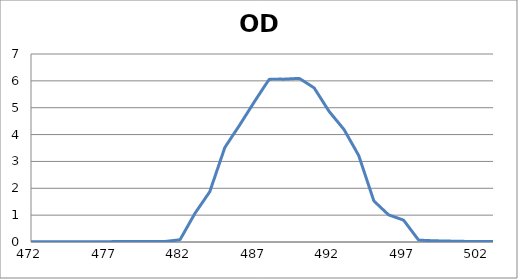
| Category | Series 0 |
|---|---|
| 2600.0 | 0.183 |
| 2599.0 | 0.183 |
| 2598.0 | 0.182 |
| 2597.0 | 0.182 |
| 2596.0 | 0.181 |
| 2595.0 | 0.18 |
| 2594.0 | 0.179 |
| 2593.0 | 0.178 |
| 2592.0 | 0.177 |
| 2591.0 | 0.175 |
| 2590.0 | 0.174 |
| 2589.0 | 0.173 |
| 2588.0 | 0.171 |
| 2587.0 | 0.169 |
| 2586.0 | 0.167 |
| 2585.0 | 0.166 |
| 2584.0 | 0.164 |
| 2583.0 | 0.163 |
| 2582.0 | 0.161 |
| 2581.0 | 0.159 |
| 2580.0 | 0.157 |
| 2579.0 | 0.155 |
| 2578.0 | 0.153 |
| 2577.0 | 0.151 |
| 2576.0 | 0.15 |
| 2575.0 | 0.148 |
| 2574.0 | 0.146 |
| 2573.0 | 0.145 |
| 2572.0 | 0.143 |
| 2571.0 | 0.141 |
| 2570.0 | 0.139 |
| 2569.0 | 0.138 |
| 2568.0 | 0.136 |
| 2567.0 | 0.135 |
| 2566.0 | 0.133 |
| 2565.0 | 0.132 |
| 2564.0 | 0.131 |
| 2563.0 | 0.13 |
| 2562.0 | 0.129 |
| 2561.0 | 0.129 |
| 2560.0 | 0.128 |
| 2559.0 | 0.128 |
| 2558.0 | 0.127 |
| 2557.0 | 0.127 |
| 2556.0 | 0.127 |
| 2555.0 | 0.127 |
| 2554.0 | 0.128 |
| 2553.0 | 0.128 |
| 2552.0 | 0.128 |
| 2551.0 | 0.129 |
| 2550.0 | 0.129 |
| 2549.0 | 0.13 |
| 2548.0 | 0.131 |
| 2547.0 | 0.132 |
| 2546.0 | 0.133 |
| 2545.0 | 0.133 |
| 2544.0 | 0.134 |
| 2543.0 | 0.135 |
| 2542.0 | 0.136 |
| 2541.0 | 0.137 |
| 2540.0 | 0.138 |
| 2539.0 | 0.138 |
| 2538.0 | 0.139 |
| 2537.0 | 0.139 |
| 2536.0 | 0.14 |
| 2535.0 | 0.14 |
| 2534.0 | 0.14 |
| 2533.0 | 0.14 |
| 2532.0 | 0.141 |
| 2531.0 | 0.141 |
| 2530.0 | 0.14 |
| 2529.0 | 0.14 |
| 2528.0 | 0.14 |
| 2527.0 | 0.139 |
| 2526.0 | 0.138 |
| 2525.0 | 0.137 |
| 2524.0 | 0.137 |
| 2523.0 | 0.136 |
| 2522.0 | 0.135 |
| 2521.0 | 0.133 |
| 2520.0 | 0.132 |
| 2519.0 | 0.13 |
| 2518.0 | 0.129 |
| 2517.0 | 0.127 |
| 2516.0 | 0.125 |
| 2515.0 | 0.123 |
| 2514.0 | 0.122 |
| 2513.0 | 0.12 |
| 2512.0 | 0.118 |
| 2511.0 | 0.116 |
| 2510.0 | 0.115 |
| 2509.0 | 0.113 |
| 2508.0 | 0.111 |
| 2507.0 | 0.109 |
| 2506.0 | 0.108 |
| 2505.0 | 0.106 |
| 2504.0 | 0.105 |
| 2503.0 | 0.104 |
| 2502.0 | 0.102 |
| 2501.0 | 0.101 |
| 2500.0 | 0.1 |
| 2499.0 | 0.1 |
| 2498.0 | 0.1 |
| 2497.0 | 0.099 |
| 2496.0 | 0.099 |
| 2495.0 | 0.099 |
| 2494.0 | 0.099 |
| 2493.0 | 0.1 |
| 2492.0 | 0.1 |
| 2491.0 | 0.101 |
| 2490.0 | 0.102 |
| 2489.0 | 0.103 |
| 2488.0 | 0.104 |
| 2487.0 | 0.105 |
| 2486.0 | 0.107 |
| 2485.0 | 0.108 |
| 2484.0 | 0.11 |
| 2483.0 | 0.112 |
| 2482.0 | 0.113 |
| 2481.0 | 0.115 |
| 2480.0 | 0.117 |
| 2479.0 | 0.119 |
| 2478.0 | 0.121 |
| 2477.0 | 0.123 |
| 2476.0 | 0.125 |
| 2475.0 | 0.126 |
| 2474.0 | 0.128 |
| 2473.0 | 0.13 |
| 2472.0 | 0.132 |
| 2471.0 | 0.133 |
| 2470.0 | 0.135 |
| 2469.0 | 0.136 |
| 2468.0 | 0.137 |
| 2467.0 | 0.137 |
| 2466.0 | 0.138 |
| 2465.0 | 0.139 |
| 2464.0 | 0.139 |
| 2463.0 | 0.139 |
| 2462.0 | 0.139 |
| 2461.0 | 0.139 |
| 2460.0 | 0.138 |
| 2459.0 | 0.138 |
| 2458.0 | 0.137 |
| 2457.0 | 0.136 |
| 2456.0 | 0.135 |
| 2455.0 | 0.134 |
| 2454.0 | 0.132 |
| 2453.0 | 0.131 |
| 2452.0 | 0.129 |
| 2451.0 | 0.127 |
| 2450.0 | 0.125 |
| 2449.0 | 0.123 |
| 2448.0 | 0.121 |
| 2447.0 | 0.119 |
| 2446.0 | 0.117 |
| 2445.0 | 0.115 |
| 2444.0 | 0.113 |
| 2443.0 | 0.111 |
| 2442.0 | 0.109 |
| 2441.0 | 0.107 |
| 2440.0 | 0.105 |
| 2439.0 | 0.103 |
| 2438.0 | 0.101 |
| 2437.0 | 0.1 |
| 2436.0 | 0.098 |
| 2435.0 | 0.097 |
| 2434.0 | 0.096 |
| 2433.0 | 0.095 |
| 2432.0 | 0.095 |
| 2431.0 | 0.094 |
| 2430.0 | 0.094 |
| 2429.0 | 0.094 |
| 2428.0 | 0.094 |
| 2427.0 | 0.095 |
| 2426.0 | 0.096 |
| 2425.0 | 0.097 |
| 2424.0 | 0.098 |
| 2423.0 | 0.099 |
| 2422.0 | 0.101 |
| 2421.0 | 0.103 |
| 2420.0 | 0.105 |
| 2419.0 | 0.107 |
| 2418.0 | 0.109 |
| 2417.0 | 0.111 |
| 2416.0 | 0.113 |
| 2415.0 | 0.115 |
| 2414.0 | 0.118 |
| 2413.0 | 0.12 |
| 2412.0 | 0.123 |
| 2411.0 | 0.125 |
| 2410.0 | 0.127 |
| 2409.0 | 0.129 |
| 2408.0 | 0.131 |
| 2407.0 | 0.133 |
| 2406.0 | 0.135 |
| 2405.0 | 0.137 |
| 2404.0 | 0.138 |
| 2403.0 | 0.14 |
| 2402.0 | 0.141 |
| 2401.0 | 0.142 |
| 2400.0 | 0.143 |
| 2399.0 | 0.143 |
| 2398.0 | 0.144 |
| 2397.0 | 0.144 |
| 2396.0 | 0.144 |
| 2395.0 | 0.144 |
| 2394.0 | 0.143 |
| 2393.0 | 0.143 |
| 2392.0 | 0.142 |
| 2391.0 | 0.141 |
| 2390.0 | 0.139 |
| 2389.0 | 0.138 |
| 2388.0 | 0.136 |
| 2387.0 | 0.134 |
| 2386.0 | 0.132 |
| 2385.0 | 0.131 |
| 2384.0 | 0.128 |
| 2383.0 | 0.126 |
| 2382.0 | 0.124 |
| 2381.0 | 0.122 |
| 2380.0 | 0.119 |
| 2379.0 | 0.117 |
| 2378.0 | 0.115 |
| 2377.0 | 0.112 |
| 2376.0 | 0.11 |
| 2375.0 | 0.108 |
| 2374.0 | 0.106 |
| 2373.0 | 0.104 |
| 2372.0 | 0.103 |
| 2371.0 | 0.101 |
| 2370.0 | 0.1 |
| 2369.0 | 0.098 |
| 2368.0 | 0.097 |
| 2367.0 | 0.096 |
| 2366.0 | 0.096 |
| 2365.0 | 0.095 |
| 2364.0 | 0.095 |
| 2363.0 | 0.095 |
| 2362.0 | 0.095 |
| 2361.0 | 0.095 |
| 2360.0 | 0.095 |
| 2359.0 | 0.096 |
| 2358.0 | 0.097 |
| 2357.0 | 0.098 |
| 2356.0 | 0.099 |
| 2355.0 | 0.1 |
| 2354.0 | 0.101 |
| 2353.0 | 0.103 |
| 2352.0 | 0.104 |
| 2351.0 | 0.105 |
| 2350.0 | 0.107 |
| 2349.0 | 0.108 |
| 2348.0 | 0.11 |
| 2347.0 | 0.111 |
| 2346.0 | 0.113 |
| 2345.0 | 0.114 |
| 2344.0 | 0.115 |
| 2343.0 | 0.117 |
| 2342.0 | 0.118 |
| 2341.0 | 0.118 |
| 2340.0 | 0.119 |
| 2339.0 | 0.12 |
| 2338.0 | 0.12 |
| 2337.0 | 0.121 |
| 2336.0 | 0.121 |
| 2335.0 | 0.121 |
| 2334.0 | 0.121 |
| 2333.0 | 0.121 |
| 2332.0 | 0.12 |
| 2331.0 | 0.12 |
| 2330.0 | 0.119 |
| 2329.0 | 0.119 |
| 2328.0 | 0.118 |
| 2327.0 | 0.117 |
| 2326.0 | 0.116 |
| 2325.0 | 0.115 |
| 2324.0 | 0.113 |
| 2323.0 | 0.112 |
| 2322.0 | 0.111 |
| 2321.0 | 0.11 |
| 2320.0 | 0.108 |
| 2319.0 | 0.107 |
| 2318.0 | 0.106 |
| 2317.0 | 0.104 |
| 2316.0 | 0.103 |
| 2315.0 | 0.102 |
| 2314.0 | 0.101 |
| 2313.0 | 0.1 |
| 2312.0 | 0.1 |
| 2311.0 | 0.099 |
| 2310.0 | 0.099 |
| 2309.0 | 0.098 |
| 2308.0 | 0.098 |
| 2307.0 | 0.098 |
| 2306.0 | 0.098 |
| 2305.0 | 0.099 |
| 2304.0 | 0.099 |
| 2303.0 | 0.099 |
| 2302.0 | 0.1 |
| 2301.0 | 0.101 |
| 2300.0 | 0.102 |
| 2299.0 | 0.103 |
| 2298.0 | 0.104 |
| 2297.0 | 0.105 |
| 2296.0 | 0.107 |
| 2295.0 | 0.108 |
| 2294.0 | 0.109 |
| 2293.0 | 0.11 |
| 2292.0 | 0.112 |
| 2291.0 | 0.113 |
| 2290.0 | 0.114 |
| 2289.0 | 0.116 |
| 2288.0 | 0.117 |
| 2287.0 | 0.119 |
| 2286.0 | 0.12 |
| 2285.0 | 0.121 |
| 2284.0 | 0.122 |
| 2283.0 | 0.123 |
| 2282.0 | 0.124 |
| 2281.0 | 0.125 |
| 2280.0 | 0.125 |
| 2279.0 | 0.126 |
| 2278.0 | 0.127 |
| 2277.0 | 0.127 |
| 2276.0 | 0.127 |
| 2275.0 | 0.128 |
| 2274.0 | 0.128 |
| 2273.0 | 0.128 |
| 2272.0 | 0.128 |
| 2271.0 | 0.128 |
| 2270.0 | 0.128 |
| 2269.0 | 0.128 |
| 2268.0 | 0.128 |
| 2267.0 | 0.127 |
| 2266.0 | 0.127 |
| 2265.0 | 0.127 |
| 2264.0 | 0.126 |
| 2263.0 | 0.126 |
| 2262.0 | 0.126 |
| 2261.0 | 0.125 |
| 2260.0 | 0.125 |
| 2259.0 | 0.125 |
| 2258.0 | 0.125 |
| 2257.0 | 0.125 |
| 2256.0 | 0.125 |
| 2255.0 | 0.125 |
| 2254.0 | 0.125 |
| 2253.0 | 0.124 |
| 2252.0 | 0.124 |
| 2251.0 | 0.125 |
| 2250.0 | 0.125 |
| 2249.0 | 0.125 |
| 2248.0 | 0.125 |
| 2247.0 | 0.125 |
| 2246.0 | 0.125 |
| 2245.0 | 0.126 |
| 2244.0 | 0.126 |
| 2243.0 | 0.126 |
| 2242.0 | 0.127 |
| 2241.0 | 0.127 |
| 2240.0 | 0.127 |
| 2239.0 | 0.128 |
| 2238.0 | 0.128 |
| 2237.0 | 0.129 |
| 2236.0 | 0.129 |
| 2235.0 | 0.129 |
| 2234.0 | 0.13 |
| 2233.0 | 0.131 |
| 2232.0 | 0.131 |
| 2231.0 | 0.132 |
| 2230.0 | 0.133 |
| 2229.0 | 0.134 |
| 2228.0 | 0.135 |
| 2227.0 | 0.136 |
| 2226.0 | 0.137 |
| 2225.0 | 0.138 |
| 2224.0 | 0.14 |
| 2223.0 | 0.142 |
| 2222.0 | 0.143 |
| 2221.0 | 0.145 |
| 2220.0 | 0.146 |
| 2219.0 | 0.148 |
| 2218.0 | 0.15 |
| 2217.0 | 0.151 |
| 2216.0 | 0.152 |
| 2215.0 | 0.154 |
| 2214.0 | 0.155 |
| 2213.0 | 0.156 |
| 2212.0 | 0.157 |
| 2211.0 | 0.158 |
| 2210.0 | 0.158 |
| 2209.0 | 0.158 |
| 2208.0 | 0.158 |
| 2207.0 | 0.157 |
| 2206.0 | 0.156 |
| 2205.0 | 0.155 |
| 2204.0 | 0.153 |
| 2203.0 | 0.151 |
| 2202.0 | 0.149 |
| 2201.0 | 0.146 |
| 2200.0 | 0.143 |
| 2199.0 | 0.14 |
| 2198.0 | 0.137 |
| 2197.0 | 0.134 |
| 2196.0 | 0.131 |
| 2195.0 | 0.128 |
| 2194.0 | 0.125 |
| 2193.0 | 0.123 |
| 2192.0 | 0.12 |
| 2191.0 | 0.118 |
| 2190.0 | 0.116 |
| 2189.0 | 0.113 |
| 2188.0 | 0.111 |
| 2187.0 | 0.109 |
| 2186.0 | 0.107 |
| 2185.0 | 0.106 |
| 2184.0 | 0.104 |
| 2183.0 | 0.102 |
| 2182.0 | 0.101 |
| 2181.0 | 0.099 |
| 2180.0 | 0.098 |
| 2179.0 | 0.096 |
| 2178.0 | 0.095 |
| 2177.0 | 0.094 |
| 2176.0 | 0.093 |
| 2175.0 | 0.092 |
| 2174.0 | 0.091 |
| 2173.0 | 0.09 |
| 2172.0 | 0.09 |
| 2171.0 | 0.09 |
| 2170.0 | 0.09 |
| 2169.0 | 0.09 |
| 2168.0 | 0.09 |
| 2167.0 | 0.09 |
| 2166.0 | 0.091 |
| 2165.0 | 0.092 |
| 2164.0 | 0.093 |
| 2163.0 | 0.094 |
| 2162.0 | 0.095 |
| 2161.0 | 0.097 |
| 2160.0 | 0.099 |
| 2159.0 | 0.101 |
| 2158.0 | 0.103 |
| 2157.0 | 0.105 |
| 2156.0 | 0.107 |
| 2155.0 | 0.11 |
| 2154.0 | 0.112 |
| 2153.0 | 0.114 |
| 2152.0 | 0.117 |
| 2151.0 | 0.119 |
| 2150.0 | 0.121 |
| 2149.0 | 0.123 |
| 2148.0 | 0.125 |
| 2147.0 | 0.126 |
| 2146.0 | 0.128 |
| 2145.0 | 0.129 |
| 2144.0 | 0.13 |
| 2143.0 | 0.131 |
| 2142.0 | 0.132 |
| 2141.0 | 0.132 |
| 2140.0 | 0.132 |
| 2139.0 | 0.132 |
| 2138.0 | 0.132 |
| 2137.0 | 0.131 |
| 2136.0 | 0.13 |
| 2135.0 | 0.129 |
| 2134.0 | 0.128 |
| 2133.0 | 0.127 |
| 2132.0 | 0.126 |
| 2131.0 | 0.124 |
| 2130.0 | 0.122 |
| 2129.0 | 0.121 |
| 2128.0 | 0.119 |
| 2127.0 | 0.117 |
| 2126.0 | 0.116 |
| 2125.0 | 0.114 |
| 2124.0 | 0.112 |
| 2123.0 | 0.111 |
| 2122.0 | 0.109 |
| 2121.0 | 0.108 |
| 2120.0 | 0.107 |
| 2119.0 | 0.107 |
| 2118.0 | 0.106 |
| 2117.0 | 0.106 |
| 2116.0 | 0.106 |
| 2115.0 | 0.106 |
| 2114.0 | 0.107 |
| 2113.0 | 0.108 |
| 2112.0 | 0.109 |
| 2111.0 | 0.111 |
| 2110.0 | 0.112 |
| 2109.0 | 0.114 |
| 2108.0 | 0.116 |
| 2107.0 | 0.118 |
| 2106.0 | 0.12 |
| 2105.0 | 0.123 |
| 2104.0 | 0.125 |
| 2103.0 | 0.127 |
| 2102.0 | 0.129 |
| 2101.0 | 0.131 |
| 2100.0 | 0.133 |
| 2099.0 | 0.134 |
| 2098.0 | 0.136 |
| 2097.0 | 0.137 |
| 2096.0 | 0.137 |
| 2095.0 | 0.138 |
| 2094.0 | 0.138 |
| 2093.0 | 0.138 |
| 2092.0 | 0.138 |
| 2091.0 | 0.137 |
| 2090.0 | 0.136 |
| 2089.0 | 0.135 |
| 2088.0 | 0.133 |
| 2087.0 | 0.131 |
| 2086.0 | 0.129 |
| 2085.0 | 0.127 |
| 2084.0 | 0.125 |
| 2083.0 | 0.122 |
| 2082.0 | 0.12 |
| 2081.0 | 0.117 |
| 2080.0 | 0.114 |
| 2079.0 | 0.112 |
| 2078.0 | 0.109 |
| 2077.0 | 0.107 |
| 2076.0 | 0.105 |
| 2075.0 | 0.103 |
| 2074.0 | 0.102 |
| 2073.0 | 0.1 |
| 2072.0 | 0.1 |
| 2071.0 | 0.099 |
| 2070.0 | 0.1 |
| 2069.0 | 0.1 |
| 2068.0 | 0.101 |
| 2067.0 | 0.103 |
| 2066.0 | 0.105 |
| 2065.0 | 0.107 |
| 2064.0 | 0.11 |
| 2063.0 | 0.112 |
| 2062.0 | 0.116 |
| 2061.0 | 0.119 |
| 2060.0 | 0.122 |
| 2059.0 | 0.125 |
| 2058.0 | 0.129 |
| 2057.0 | 0.132 |
| 2056.0 | 0.135 |
| 2055.0 | 0.138 |
| 2054.0 | 0.141 |
| 2053.0 | 0.143 |
| 2052.0 | 0.146 |
| 2051.0 | 0.147 |
| 2050.0 | 0.149 |
| 2049.0 | 0.15 |
| 2048.0 | 0.151 |
| 2047.0 | 0.151 |
| 2046.0 | 0.15 |
| 2045.0 | 0.15 |
| 2044.0 | 0.149 |
| 2043.0 | 0.147 |
| 2042.0 | 0.145 |
| 2041.0 | 0.143 |
| 2040.0 | 0.14 |
| 2039.0 | 0.138 |
| 2038.0 | 0.135 |
| 2037.0 | 0.132 |
| 2036.0 | 0.128 |
| 2035.0 | 0.125 |
| 2034.0 | 0.122 |
| 2033.0 | 0.119 |
| 2032.0 | 0.117 |
| 2031.0 | 0.114 |
| 2030.0 | 0.112 |
| 2029.0 | 0.111 |
| 2028.0 | 0.11 |
| 2027.0 | 0.109 |
| 2026.0 | 0.109 |
| 2025.0 | 0.11 |
| 2024.0 | 0.111 |
| 2023.0 | 0.113 |
| 2022.0 | 0.116 |
| 2021.0 | 0.119 |
| 2020.0 | 0.122 |
| 2019.0 | 0.126 |
| 2018.0 | 0.13 |
| 2017.0 | 0.135 |
| 2016.0 | 0.139 |
| 2015.0 | 0.143 |
| 2014.0 | 0.148 |
| 2013.0 | 0.152 |
| 2012.0 | 0.157 |
| 2011.0 | 0.161 |
| 2010.0 | 0.164 |
| 2009.0 | 0.168 |
| 2008.0 | 0.171 |
| 2007.0 | 0.173 |
| 2006.0 | 0.175 |
| 2005.0 | 0.177 |
| 2004.0 | 0.177 |
| 2003.0 | 0.178 |
| 2002.0 | 0.178 |
| 2001.0 | 0.177 |
| 2000.0 | 0.175 |
| 1999.0 | 0.173 |
| 1998.0 | 0.17 |
| 1997.0 | 0.167 |
| 1996.0 | 0.164 |
| 1995.0 | 0.16 |
| 1994.0 | 0.155 |
| 1993.0 | 0.151 |
| 1992.0 | 0.147 |
| 1991.0 | 0.143 |
| 1990.0 | 0.138 |
| 1989.0 | 0.135 |
| 1988.0 | 0.131 |
| 1987.0 | 0.128 |
| 1986.0 | 0.126 |
| 1985.0 | 0.125 |
| 1984.0 | 0.124 |
| 1983.0 | 0.124 |
| 1982.0 | 0.125 |
| 1981.0 | 0.127 |
| 1980.0 | 0.129 |
| 1979.0 | 0.133 |
| 1978.0 | 0.137 |
| 1977.0 | 0.142 |
| 1976.0 | 0.147 |
| 1975.0 | 0.152 |
| 1974.0 | 0.159 |
| 1973.0 | 0.165 |
| 1972.0 | 0.171 |
| 1971.0 | 0.178 |
| 1970.0 | 0.184 |
| 1969.0 | 0.191 |
| 1968.0 | 0.197 |
| 1967.0 | 0.202 |
| 1966.0 | 0.207 |
| 1965.0 | 0.211 |
| 1964.0 | 0.215 |
| 1963.0 | 0.217 |
| 1962.0 | 0.22 |
| 1961.0 | 0.221 |
| 1960.0 | 0.221 |
| 1959.0 | 0.221 |
| 1958.0 | 0.219 |
| 1957.0 | 0.217 |
| 1956.0 | 0.213 |
| 1955.0 | 0.209 |
| 1954.0 | 0.204 |
| 1953.0 | 0.198 |
| 1952.0 | 0.192 |
| 1951.0 | 0.186 |
| 1950.0 | 0.178 |
| 1949.0 | 0.17 |
| 1948.0 | 0.163 |
| 1947.0 | 0.155 |
| 1946.0 | 0.147 |
| 1945.0 | 0.14 |
| 1944.0 | 0.132 |
| 1943.0 | 0.126 |
| 1942.0 | 0.121 |
| 1941.0 | 0.116 |
| 1940.0 | 0.112 |
| 1939.0 | 0.109 |
| 1938.0 | 0.108 |
| 1937.0 | 0.107 |
| 1936.0 | 0.108 |
| 1935.0 | 0.109 |
| 1934.0 | 0.112 |
| 1933.0 | 0.115 |
| 1932.0 | 0.119 |
| 1931.0 | 0.123 |
| 1930.0 | 0.128 |
| 1929.0 | 0.133 |
| 1928.0 | 0.139 |
| 1927.0 | 0.145 |
| 1926.0 | 0.151 |
| 1925.0 | 0.156 |
| 1924.0 | 0.161 |
| 1923.0 | 0.165 |
| 1922.0 | 0.169 |
| 1921.0 | 0.173 |
| 1920.0 | 0.176 |
| 1919.0 | 0.178 |
| 1918.0 | 0.18 |
| 1917.0 | 0.18 |
| 1916.0 | 0.179 |
| 1915.0 | 0.178 |
| 1914.0 | 0.176 |
| 1913.0 | 0.173 |
| 1912.0 | 0.171 |
| 1911.0 | 0.168 |
| 1910.0 | 0.164 |
| 1909.0 | 0.16 |
| 1908.0 | 0.155 |
| 1907.0 | 0.151 |
| 1906.0 | 0.146 |
| 1905.0 | 0.142 |
| 1904.0 | 0.139 |
| 1903.0 | 0.136 |
| 1902.0 | 0.133 |
| 1901.0 | 0.131 |
| 1900.0 | 0.13 |
| 1899.0 | 0.129 |
| 1898.0 | 0.13 |
| 1897.0 | 0.13 |
| 1896.0 | 0.132 |
| 1895.0 | 0.133 |
| 1894.0 | 0.135 |
| 1893.0 | 0.138 |
| 1892.0 | 0.141 |
| 1891.0 | 0.146 |
| 1890.0 | 0.15 |
| 1889.0 | 0.154 |
| 1888.0 | 0.157 |
| 1887.0 | 0.16 |
| 1886.0 | 0.163 |
| 1885.0 | 0.165 |
| 1884.0 | 0.167 |
| 1883.0 | 0.169 |
| 1882.0 | 0.17 |
| 1881.0 | 0.171 |
| 1880.0 | 0.17 |
| 1879.0 | 0.169 |
| 1878.0 | 0.166 |
| 1877.0 | 0.163 |
| 1876.0 | 0.16 |
| 1875.0 | 0.156 |
| 1874.0 | 0.152 |
| 1873.0 | 0.147 |
| 1872.0 | 0.141 |
| 1871.0 | 0.136 |
| 1870.0 | 0.131 |
| 1869.0 | 0.126 |
| 1868.0 | 0.121 |
| 1867.0 | 0.117 |
| 1866.0 | 0.113 |
| 1865.0 | 0.11 |
| 1864.0 | 0.109 |
| 1863.0 | 0.107 |
| 1862.0 | 0.107 |
| 1861.0 | 0.108 |
| 1860.0 | 0.11 |
| 1859.0 | 0.113 |
| 1858.0 | 0.116 |
| 1857.0 | 0.12 |
| 1856.0 | 0.124 |
| 1855.0 | 0.129 |
| 1854.0 | 0.134 |
| 1853.0 | 0.139 |
| 1852.0 | 0.144 |
| 1851.0 | 0.149 |
| 1850.0 | 0.153 |
| 1849.0 | 0.156 |
| 1848.0 | 0.159 |
| 1847.0 | 0.163 |
| 1846.0 | 0.165 |
| 1845.0 | 0.166 |
| 1844.0 | 0.166 |
| 1843.0 | 0.164 |
| 1842.0 | 0.161 |
| 1841.0 | 0.158 |
| 1840.0 | 0.155 |
| 1839.0 | 0.151 |
| 1838.0 | 0.146 |
| 1837.0 | 0.14 |
| 1836.0 | 0.133 |
| 1835.0 | 0.126 |
| 1834.0 | 0.12 |
| 1833.0 | 0.114 |
| 1832.0 | 0.108 |
| 1831.0 | 0.103 |
| 1830.0 | 0.099 |
| 1829.0 | 0.096 |
| 1828.0 | 0.094 |
| 1827.0 | 0.094 |
| 1826.0 | 0.095 |
| 1825.0 | 0.098 |
| 1824.0 | 0.102 |
| 1823.0 | 0.106 |
| 1822.0 | 0.111 |
| 1821.0 | 0.119 |
| 1820.0 | 0.128 |
| 1819.0 | 0.138 |
| 1818.0 | 0.147 |
| 1817.0 | 0.155 |
| 1816.0 | 0.164 |
| 1815.0 | 0.173 |
| 1814.0 | 0.181 |
| 1813.0 | 0.189 |
| 1812.0 | 0.196 |
| 1811.0 | 0.203 |
| 1810.0 | 0.209 |
| 1809.0 | 0.213 |
| 1808.0 | 0.216 |
| 1807.0 | 0.219 |
| 1806.0 | 0.22 |
| 1805.0 | 0.221 |
| 1804.0 | 0.22 |
| 1803.0 | 0.219 |
| 1802.0 | 0.216 |
| 1801.0 | 0.213 |
| 1800.0 | 0.209 |
| 1799.0 | 0.205 |
| 1798.0 | 0.201 |
| 1797.0 | 0.196 |
| 1796.0 | 0.192 |
| 1795.0 | 0.188 |
| 1794.0 | 0.185 |
| 1793.0 | 0.182 |
| 1792.0 | 0.18 |
| 1791.0 | 0.179 |
| 1790.0 | 0.179 |
| 1789.0 | 0.18 |
| 1788.0 | 0.182 |
| 1787.0 | 0.185 |
| 1786.0 | 0.189 |
| 1785.0 | 0.193 |
| 1784.0 | 0.198 |
| 1783.0 | 0.204 |
| 1782.0 | 0.209 |
| 1781.0 | 0.214 |
| 1780.0 | 0.219 |
| 1779.0 | 0.223 |
| 1778.0 | 0.227 |
| 1777.0 | 0.23 |
| 1776.0 | 0.232 |
| 1775.0 | 0.233 |
| 1774.0 | 0.233 |
| 1773.0 | 0.232 |
| 1772.0 | 0.229 |
| 1771.0 | 0.226 |
| 1770.0 | 0.221 |
| 1769.0 | 0.215 |
| 1768.0 | 0.208 |
| 1767.0 | 0.2 |
| 1766.0 | 0.191 |
| 1765.0 | 0.182 |
| 1764.0 | 0.172 |
| 1763.0 | 0.162 |
| 1762.0 | 0.152 |
| 1761.0 | 0.142 |
| 1760.0 | 0.133 |
| 1759.0 | 0.125 |
| 1758.0 | 0.117 |
| 1757.0 | 0.112 |
| 1756.0 | 0.107 |
| 1755.0 | 0.105 |
| 1754.0 | 0.104 |
| 1753.0 | 0.105 |
| 1752.0 | 0.108 |
| 1751.0 | 0.112 |
| 1750.0 | 0.118 |
| 1749.0 | 0.124 |
| 1748.0 | 0.131 |
| 1747.0 | 0.139 |
| 1746.0 | 0.147 |
| 1745.0 | 0.155 |
| 1744.0 | 0.163 |
| 1743.0 | 0.169 |
| 1742.0 | 0.175 |
| 1741.0 | 0.18 |
| 1740.0 | 0.184 |
| 1739.0 | 0.187 |
| 1738.0 | 0.189 |
| 1737.0 | 0.189 |
| 1736.0 | 0.188 |
| 1735.0 | 0.185 |
| 1734.0 | 0.182 |
| 1733.0 | 0.177 |
| 1732.0 | 0.171 |
| 1731.0 | 0.165 |
| 1730.0 | 0.157 |
| 1729.0 | 0.148 |
| 1728.0 | 0.139 |
| 1727.0 | 0.129 |
| 1726.0 | 0.119 |
| 1725.0 | 0.109 |
| 1724.0 | 0.099 |
| 1723.0 | 0.09 |
| 1722.0 | 0.08 |
| 1721.0 | 0.072 |
| 1720.0 | 0.064 |
| 1719.0 | 0.057 |
| 1718.0 | 0.051 |
| 1717.0 | 0.046 |
| 1716.0 | 0.042 |
| 1715.0 | 0.039 |
| 1714.0 | 0.036 |
| 1713.0 | 0.035 |
| 1712.0 | 0.034 |
| 1711.0 | 0.034 |
| 1710.0 | 0.035 |
| 1709.0 | 0.036 |
| 1708.0 | 0.038 |
| 1707.0 | 0.04 |
| 1706.0 | 0.042 |
| 1705.0 | 0.044 |
| 1704.0 | 0.047 |
| 1703.0 | 0.05 |
| 1702.0 | 0.054 |
| 1701.0 | 0.057 |
| 1700.0 | 0.061 |
| 1699.0 | 0.065 |
| 1698.0 | 0.069 |
| 1697.0 | 0.073 |
| 1696.0 | 0.078 |
| 1695.0 | 0.083 |
| 1694.0 | 0.087 |
| 1693.0 | 0.092 |
| 1692.0 | 0.096 |
| 1691.0 | 0.101 |
| 1690.0 | 0.105 |
| 1689.0 | 0.109 |
| 1688.0 | 0.112 |
| 1687.0 | 0.114 |
| 1686.0 | 0.116 |
| 1685.0 | 0.117 |
| 1684.0 | 0.116 |
| 1683.0 | 0.115 |
| 1682.0 | 0.113 |
| 1681.0 | 0.11 |
| 1680.0 | 0.105 |
| 1679.0 | 0.1 |
| 1678.0 | 0.094 |
| 1677.0 | 0.087 |
| 1676.0 | 0.079 |
| 1675.0 | 0.071 |
| 1674.0 | 0.063 |
| 1673.0 | 0.056 |
| 1672.0 | 0.049 |
| 1671.0 | 0.043 |
| 1670.0 | 0.038 |
| 1669.0 | 0.034 |
| 1668.0 | 0.031 |
| 1667.0 | 0.031 |
| 1666.0 | 0.032 |
| 1665.0 | 0.035 |
| 1664.0 | 0.04 |
| 1663.0 | 0.046 |
| 1662.0 | 0.053 |
| 1661.0 | 0.061 |
| 1660.0 | 0.069 |
| 1659.0 | 0.078 |
| 1658.0 | 0.086 |
| 1657.0 | 0.094 |
| 1656.0 | 0.101 |
| 1655.0 | 0.107 |
| 1654.0 | 0.112 |
| 1653.0 | 0.116 |
| 1652.0 | 0.118 |
| 1651.0 | 0.119 |
| 1650.0 | 0.118 |
| 1649.0 | 0.116 |
| 1648.0 | 0.112 |
| 1647.0 | 0.107 |
| 1646.0 | 0.101 |
| 1645.0 | 0.094 |
| 1644.0 | 0.086 |
| 1643.0 | 0.077 |
| 1642.0 | 0.068 |
| 1641.0 | 0.059 |
| 1640.0 | 0.051 |
| 1639.0 | 0.044 |
| 1638.0 | 0.038 |
| 1637.0 | 0.034 |
| 1636.0 | 0.031 |
| 1635.0 | 0.031 |
| 1634.0 | 0.032 |
| 1633.0 | 0.035 |
| 1632.0 | 0.039 |
| 1631.0 | 0.044 |
| 1630.0 | 0.051 |
| 1629.0 | 0.058 |
| 1628.0 | 0.065 |
| 1627.0 | 0.072 |
| 1626.0 | 0.079 |
| 1625.0 | 0.084 |
| 1624.0 | 0.089 |
| 1623.0 | 0.092 |
| 1622.0 | 0.094 |
| 1621.0 | 0.094 |
| 1620.0 | 0.094 |
| 1619.0 | 0.092 |
| 1618.0 | 0.089 |
| 1617.0 | 0.084 |
| 1616.0 | 0.079 |
| 1615.0 | 0.074 |
| 1614.0 | 0.068 |
| 1613.0 | 0.062 |
| 1612.0 | 0.057 |
| 1611.0 | 0.052 |
| 1610.0 | 0.048 |
| 1609.0 | 0.046 |
| 1608.0 | 0.045 |
| 1607.0 | 0.045 |
| 1606.0 | 0.047 |
| 1605.0 | 0.05 |
| 1604.0 | 0.055 |
| 1603.0 | 0.061 |
| 1602.0 | 0.067 |
| 1601.0 | 0.075 |
| 1600.0 | 0.082 |
| 1599.0 | 0.089 |
| 1598.0 | 0.096 |
| 1597.0 | 0.102 |
| 1596.0 | 0.107 |
| 1595.0 | 0.111 |
| 1594.0 | 0.113 |
| 1593.0 | 0.114 |
| 1592.0 | 0.114 |
| 1591.0 | 0.113 |
| 1590.0 | 0.11 |
| 1589.0 | 0.106 |
| 1588.0 | 0.101 |
| 1587.0 | 0.095 |
| 1586.0 | 0.089 |
| 1585.0 | 0.083 |
| 1584.0 | 0.077 |
| 1583.0 | 0.071 |
| 1582.0 | 0.066 |
| 1581.0 | 0.062 |
| 1580.0 | 0.059 |
| 1579.0 | 0.056 |
| 1578.0 | 0.055 |
| 1577.0 | 0.054 |
| 1576.0 | 0.055 |
| 1575.0 | 0.055 |
| 1574.0 | 0.057 |
| 1573.0 | 0.058 |
| 1572.0 | 0.06 |
| 1571.0 | 0.061 |
| 1570.0 | 0.062 |
| 1569.0 | 0.063 |
| 1568.0 | 0.063 |
| 1567.0 | 0.063 |
| 1566.0 | 0.062 |
| 1565.0 | 0.06 |
| 1564.0 | 0.058 |
| 1563.0 | 0.055 |
| 1562.0 | 0.052 |
| 1561.0 | 0.05 |
| 1560.0 | 0.047 |
| 1559.0 | 0.045 |
| 1558.0 | 0.043 |
| 1557.0 | 0.042 |
| 1556.0 | 0.042 |
| 1555.0 | 0.043 |
| 1554.0 | 0.044 |
| 1553.0 | 0.046 |
| 1552.0 | 0.049 |
| 1551.0 | 0.051 |
| 1550.0 | 0.055 |
| 1549.0 | 0.058 |
| 1548.0 | 0.06 |
| 1547.0 | 0.063 |
| 1546.0 | 0.064 |
| 1545.0 | 0.065 |
| 1544.0 | 0.066 |
| 1543.0 | 0.065 |
| 1542.0 | 0.064 |
| 1541.0 | 0.062 |
| 1540.0 | 0.061 |
| 1539.0 | 0.058 |
| 1538.0 | 0.056 |
| 1537.0 | 0.055 |
| 1536.0 | 0.054 |
| 1535.0 | 0.054 |
| 1534.0 | 0.055 |
| 1533.0 | 0.057 |
| 1532.0 | 0.06 |
| 1531.0 | 0.065 |
| 1530.0 | 0.07 |
| 1529.0 | 0.076 |
| 1528.0 | 0.083 |
| 1527.0 | 0.091 |
| 1526.0 | 0.098 |
| 1525.0 | 0.105 |
| 1524.0 | 0.112 |
| 1523.0 | 0.118 |
| 1522.0 | 0.122 |
| 1521.0 | 0.125 |
| 1520.0 | 0.127 |
| 1519.0 | 0.126 |
| 1518.0 | 0.125 |
| 1517.0 | 0.121 |
| 1516.0 | 0.117 |
| 1515.0 | 0.111 |
| 1514.0 | 0.104 |
| 1513.0 | 0.097 |
| 1512.0 | 0.09 |
| 1511.0 | 0.084 |
| 1510.0 | 0.078 |
| 1509.0 | 0.074 |
| 1508.0 | 0.071 |
| 1507.0 | 0.07 |
| 1506.0 | 0.071 |
| 1505.0 | 0.074 |
| 1504.0 | 0.078 |
| 1503.0 | 0.084 |
| 1502.0 | 0.091 |
| 1501.0 | 0.098 |
| 1500.0 | 0.105 |
| 1499.0 | 0.111 |
| 1498.0 | 0.117 |
| 1497.0 | 0.122 |
| 1496.0 | 0.126 |
| 1495.0 | 0.128 |
| 1494.0 | 0.129 |
| 1493.0 | 0.128 |
| 1492.0 | 0.126 |
| 1491.0 | 0.122 |
| 1490.0 | 0.118 |
| 1489.0 | 0.112 |
| 1488.0 | 0.106 |
| 1487.0 | 0.1 |
| 1486.0 | 0.094 |
| 1485.0 | 0.088 |
| 1484.0 | 0.084 |
| 1483.0 | 0.081 |
| 1482.0 | 0.079 |
| 1481.0 | 0.079 |
| 1480.0 | 0.079 |
| 1479.0 | 0.082 |
| 1478.0 | 0.085 |
| 1477.0 | 0.089 |
| 1476.0 | 0.093 |
| 1475.0 | 0.098 |
| 1474.0 | 0.102 |
| 1473.0 | 0.105 |
| 1472.0 | 0.107 |
| 1471.0 | 0.109 |
| 1470.0 | 0.11 |
| 1469.0 | 0.11 |
| 1468.0 | 0.109 |
| 1467.0 | 0.107 |
| 1466.0 | 0.105 |
| 1465.0 | 0.103 |
| 1464.0 | 0.102 |
| 1463.0 | 0.1 |
| 1462.0 | 0.1 |
| 1461.0 | 0.1 |
| 1460.0 | 0.1 |
| 1459.0 | 0.102 |
| 1458.0 | 0.104 |
| 1457.0 | 0.107 |
| 1456.0 | 0.11 |
| 1455.0 | 0.114 |
| 1454.0 | 0.117 |
| 1453.0 | 0.12 |
| 1452.0 | 0.123 |
| 1451.0 | 0.125 |
| 1450.0 | 0.127 |
| 1449.0 | 0.128 |
| 1448.0 | 0.129 |
| 1447.0 | 0.129 |
| 1446.0 | 0.129 |
| 1445.0 | 0.129 |
| 1444.0 | 0.13 |
| 1443.0 | 0.131 |
| 1442.0 | 0.133 |
| 1441.0 | 0.135 |
| 1440.0 | 0.139 |
| 1439.0 | 0.143 |
| 1438.0 | 0.148 |
| 1437.0 | 0.154 |
| 1436.0 | 0.16 |
| 1435.0 | 0.166 |
| 1434.0 | 0.171 |
| 1433.0 | 0.176 |
| 1432.0 | 0.179 |
| 1431.0 | 0.181 |
| 1430.0 | 0.182 |
| 1429.0 | 0.181 |
| 1428.0 | 0.179 |
| 1427.0 | 0.175 |
| 1426.0 | 0.171 |
| 1425.0 | 0.166 |
| 1424.0 | 0.16 |
| 1423.0 | 0.156 |
| 1422.0 | 0.152 |
| 1421.0 | 0.149 |
| 1420.0 | 0.149 |
| 1419.0 | 0.15 |
| 1418.0 | 0.154 |
| 1417.0 | 0.16 |
| 1416.0 | 0.167 |
| 1415.0 | 0.175 |
| 1414.0 | 0.184 |
| 1413.0 | 0.194 |
| 1412.0 | 0.204 |
| 1411.0 | 0.213 |
| 1410.0 | 0.22 |
| 1409.0 | 0.225 |
| 1408.0 | 0.23 |
| 1407.0 | 0.233 |
| 1406.0 | 0.233 |
| 1405.0 | 0.231 |
| 1404.0 | 0.227 |
| 1403.0 | 0.221 |
| 1402.0 | 0.214 |
| 1401.0 | 0.206 |
| 1400.0 | 0.198 |
| 1399.0 | 0.19 |
| 1398.0 | 0.184 |
| 1397.0 | 0.178 |
| 1396.0 | 0.173 |
| 1395.0 | 0.171 |
| 1394.0 | 0.172 |
| 1393.0 | 0.173 |
| 1392.0 | 0.176 |
| 1391.0 | 0.18 |
| 1390.0 | 0.184 |
| 1389.0 | 0.187 |
| 1388.0 | 0.191 |
| 1387.0 | 0.195 |
| 1386.0 | 0.197 |
| 1385.0 | 0.199 |
| 1384.0 | 0.199 |
| 1383.0 | 0.197 |
| 1382.0 | 0.196 |
| 1381.0 | 0.195 |
| 1380.0 | 0.193 |
| 1379.0 | 0.191 |
| 1378.0 | 0.189 |
| 1377.0 | 0.187 |
| 1376.0 | 0.186 |
| 1375.0 | 0.186 |
| 1374.0 | 0.186 |
| 1373.0 | 0.187 |
| 1372.0 | 0.188 |
| 1371.0 | 0.189 |
| 1370.0 | 0.19 |
| 1369.0 | 0.19 |
| 1368.0 | 0.19 |
| 1367.0 | 0.19 |
| 1366.0 | 0.189 |
| 1365.0 | 0.189 |
| 1364.0 | 0.188 |
| 1363.0 | 0.189 |
| 1362.0 | 0.19 |
| 1361.0 | 0.194 |
| 1360.0 | 0.199 |
| 1359.0 | 0.206 |
| 1358.0 | 0.214 |
| 1357.0 | 0.223 |
| 1356.0 | 0.233 |
| 1355.0 | 0.244 |
| 1354.0 | 0.255 |
| 1353.0 | 0.265 |
| 1352.0 | 0.273 |
| 1351.0 | 0.279 |
| 1350.0 | 0.282 |
| 1349.0 | 0.282 |
| 1348.0 | 0.28 |
| 1347.0 | 0.276 |
| 1346.0 | 0.269 |
| 1345.0 | 0.261 |
| 1344.0 | 0.252 |
| 1343.0 | 0.243 |
| 1342.0 | 0.236 |
| 1341.0 | 0.23 |
| 1340.0 | 0.226 |
| 1339.0 | 0.225 |
| 1338.0 | 0.227 |
| 1337.0 | 0.232 |
| 1336.0 | 0.239 |
| 1335.0 | 0.249 |
| 1334.0 | 0.259 |
| 1333.0 | 0.269 |
| 1332.0 | 0.278 |
| 1331.0 | 0.286 |
| 1330.0 | 0.292 |
| 1329.0 | 0.297 |
| 1328.0 | 0.298 |
| 1327.0 | 0.297 |
| 1326.0 | 0.295 |
| 1325.0 | 0.29 |
| 1324.0 | 0.284 |
| 1323.0 | 0.277 |
| 1322.0 | 0.271 |
| 1321.0 | 0.265 |
| 1320.0 | 0.26 |
| 1319.0 | 0.257 |
| 1318.0 | 0.256 |
| 1317.0 | 0.257 |
| 1316.0 | 0.259 |
| 1315.0 | 0.262 |
| 1314.0 | 0.266 |
| 1313.0 | 0.269 |
| 1312.0 | 0.272 |
| 1311.0 | 0.273 |
| 1310.0 | 0.273 |
| 1309.0 | 0.272 |
| 1308.0 | 0.269 |
| 1307.0 | 0.266 |
| 1306.0 | 0.262 |
| 1305.0 | 0.259 |
| 1304.0 | 0.257 |
| 1303.0 | 0.255 |
| 1302.0 | 0.255 |
| 1301.0 | 0.256 |
| 1300.0 | 0.259 |
| 1299.0 | 0.262 |
| 1298.0 | 0.266 |
| 1297.0 | 0.269 |
| 1296.0 | 0.273 |
| 1295.0 | 0.275 |
| 1294.0 | 0.276 |
| 1293.0 | 0.277 |
| 1292.0 | 0.276 |
| 1291.0 | 0.274 |
| 1290.0 | 0.272 |
| 1289.0 | 0.271 |
| 1288.0 | 0.27 |
| 1287.0 | 0.27 |
| 1286.0 | 0.272 |
| 1285.0 | 0.277 |
| 1284.0 | 0.284 |
| 1283.0 | 0.292 |
| 1282.0 | 0.301 |
| 1281.0 | 0.31 |
| 1280.0 | 0.319 |
| 1279.0 | 0.327 |
| 1278.0 | 0.332 |
| 1277.0 | 0.335 |
| 1276.0 | 0.336 |
| 1275.0 | 0.334 |
| 1274.0 | 0.331 |
| 1273.0 | 0.327 |
| 1272.0 | 0.322 |
| 1271.0 | 0.319 |
| 1270.0 | 0.318 |
| 1269.0 | 0.32 |
| 1268.0 | 0.324 |
| 1267.0 | 0.332 |
| 1266.0 | 0.342 |
| 1265.0 | 0.353 |
| 1264.0 | 0.365 |
| 1263.0 | 0.375 |
| 1262.0 | 0.385 |
| 1261.0 | 0.392 |
| 1260.0 | 0.396 |
| 1259.0 | 0.397 |
| 1258.0 | 0.396 |
| 1257.0 | 0.392 |
| 1256.0 | 0.387 |
| 1255.0 | 0.382 |
| 1254.0 | 0.377 |
| 1253.0 | 0.375 |
| 1252.0 | 0.376 |
| 1251.0 | 0.381 |
| 1250.0 | 0.389 |
| 1249.0 | 0.4 |
| 1248.0 | 0.413 |
| 1247.0 | 0.427 |
| 1246.0 | 0.441 |
| 1245.0 | 0.452 |
| 1244.0 | 0.461 |
| 1243.0 | 0.465 |
| 1242.0 | 0.465 |
| 1241.0 | 0.46 |
| 1240.0 | 0.451 |
| 1239.0 | 0.439 |
| 1238.0 | 0.424 |
| 1237.0 | 0.41 |
| 1236.0 | 0.395 |
| 1235.0 | 0.384 |
| 1234.0 | 0.377 |
| 1233.0 | 0.375 |
| 1232.0 | 0.379 |
| 1231.0 | 0.386 |
| 1230.0 | 0.396 |
| 1229.0 | 0.407 |
| 1228.0 | 0.417 |
| 1227.0 | 0.425 |
| 1226.0 | 0.43 |
| 1225.0 | 0.431 |
| 1224.0 | 0.428 |
| 1223.0 | 0.421 |
| 1222.0 | 0.411 |
| 1221.0 | 0.399 |
| 1220.0 | 0.388 |
| 1219.0 | 0.377 |
| 1218.0 | 0.369 |
| 1217.0 | 0.364 |
| 1216.0 | 0.362 |
| 1215.0 | 0.363 |
| 1214.0 | 0.367 |
| 1213.0 | 0.373 |
| 1212.0 | 0.379 |
| 1211.0 | 0.384 |
| 1210.0 | 0.387 |
| 1209.0 | 0.387 |
| 1208.0 | 0.385 |
| 1207.0 | 0.381 |
| 1206.0 | 0.376 |
| 1205.0 | 0.369 |
| 1204.0 | 0.362 |
| 1203.0 | 0.357 |
| 1202.0 | 0.355 |
| 1201.0 | 0.355 |
| 1200.0 | 0.359 |
| 1199.0 | 0.364 |
| 1198.0 | 0.37 |
| 1197.0 | 0.376 |
| 1196.0 | 0.381 |
| 1195.0 | 0.384 |
| 1194.0 | 0.384 |
| 1193.0 | 0.382 |
| 1192.0 | 0.377 |
| 1191.0 | 0.372 |
| 1190.0 | 0.367 |
| 1189.0 | 0.363 |
| 1188.0 | 0.362 |
| 1187.0 | 0.364 |
| 1186.0 | 0.369 |
| 1185.0 | 0.378 |
| 1184.0 | 0.388 |
| 1183.0 | 0.398 |
| 1182.0 | 0.408 |
| 1181.0 | 0.416 |
| 1180.0 | 0.422 |
| 1179.0 | 0.424 |
| 1178.0 | 0.422 |
| 1177.0 | 0.418 |
| 1176.0 | 0.412 |
| 1175.0 | 0.404 |
| 1174.0 | 0.397 |
| 1173.0 | 0.391 |
| 1172.0 | 0.387 |
| 1171.0 | 0.386 |
| 1170.0 | 0.388 |
| 1169.0 | 0.392 |
| 1168.0 | 0.398 |
| 1167.0 | 0.405 |
| 1166.0 | 0.411 |
| 1165.0 | 0.416 |
| 1164.0 | 0.418 |
| 1163.0 | 0.418 |
| 1162.0 | 0.415 |
| 1161.0 | 0.41 |
| 1160.0 | 0.404 |
| 1159.0 | 0.396 |
| 1158.0 | 0.39 |
| 1157.0 | 0.384 |
| 1156.0 | 0.38 |
| 1155.0 | 0.377 |
| 1154.0 | 0.376 |
| 1153.0 | 0.375 |
| 1152.0 | 0.375 |
| 1151.0 | 0.374 |
| 1150.0 | 0.373 |
| 1149.0 | 0.372 |
| 1148.0 | 0.371 |
| 1147.0 | 0.37 |
| 1146.0 | 0.369 |
| 1145.0 | 0.369 |
| 1144.0 | 0.369 |
| 1143.0 | 0.37 |
| 1142.0 | 0.371 |
| 1141.0 | 0.372 |
| 1140.0 | 0.373 |
| 1139.0 | 0.374 |
| 1138.0 | 0.373 |
| 1137.0 | 0.372 |
| 1136.0 | 0.371 |
| 1135.0 | 0.37 |
| 1134.0 | 0.37 |
| 1133.0 | 0.371 |
| 1132.0 | 0.374 |
| 1131.0 | 0.377 |
| 1130.0 | 0.381 |
| 1129.0 | 0.386 |
| 1128.0 | 0.391 |
| 1127.0 | 0.396 |
| 1126.0 | 0.398 |
| 1125.0 | 0.399 |
| 1124.0 | 0.398 |
| 1123.0 | 0.395 |
| 1122.0 | 0.391 |
| 1121.0 | 0.386 |
| 1120.0 | 0.383 |
| 1119.0 | 0.381 |
| 1118.0 | 0.382 |
| 1117.0 | 0.385 |
| 1116.0 | 0.389 |
| 1115.0 | 0.395 |
| 1114.0 | 0.401 |
| 1113.0 | 0.405 |
| 1112.0 | 0.407 |
| 1111.0 | 0.406 |
| 1110.0 | 0.403 |
| 1109.0 | 0.397 |
| 1108.0 | 0.391 |
| 1107.0 | 0.384 |
| 1106.0 | 0.377 |
| 1105.0 | 0.371 |
| 1104.0 | 0.368 |
| 1103.0 | 0.366 |
| 1102.0 | 0.366 |
| 1101.0 | 0.366 |
| 1100.0 | 0.367 |
| 1099.0 | 0.368 |
| 1098.0 | 0.368 |
| 1097.0 | 0.367 |
| 1096.0 | 0.365 |
| 1095.0 | 0.363 |
| 1094.0 | 0.362 |
| 1093.0 | 0.36 |
| 1092.0 | 0.36 |
| 1091.0 | 0.36 |
| 1090.0 | 0.36 |
| 1089.0 | 0.36 |
| 1088.0 | 0.36 |
| 1087.0 | 0.36 |
| 1086.0 | 0.359 |
| 1085.0 | 0.358 |
| 1084.0 | 0.357 |
| 1083.0 | 0.356 |
| 1082.0 | 0.357 |
| 1081.0 | 0.359 |
| 1080.0 | 0.362 |
| 1079.0 | 0.365 |
| 1078.0 | 0.368 |
| 1077.0 | 0.37 |
| 1076.0 | 0.37 |
| 1075.0 | 0.37 |
| 1074.0 | 0.369 |
| 1073.0 | 0.369 |
| 1072.0 | 0.37 |
| 1071.0 | 0.373 |
| 1070.0 | 0.378 |
| 1069.0 | 0.385 |
| 1068.0 | 0.392 |
| 1067.0 | 0.399 |
| 1066.0 | 0.404 |
| 1065.0 | 0.406 |
| 1064.0 | 0.404 |
| 1063.0 | 0.4 |
| 1062.0 | 0.394 |
| 1061.0 | 0.387 |
| 1060.0 | 0.382 |
| 1059.0 | 0.38 |
| 1058.0 | 0.381 |
| 1057.0 | 0.386 |
| 1056.0 | 0.393 |
| 1055.0 | 0.401 |
| 1054.0 | 0.408 |
| 1053.0 | 0.411 |
| 1052.0 | 0.41 |
| 1051.0 | 0.404 |
| 1050.0 | 0.395 |
| 1049.0 | 0.384 |
| 1048.0 | 0.372 |
| 1047.0 | 0.362 |
| 1046.0 | 0.356 |
| 1045.0 | 0.355 |
| 1044.0 | 0.357 |
| 1043.0 | 0.362 |
| 1042.0 | 0.367 |
| 1041.0 | 0.369 |
| 1040.0 | 0.368 |
| 1039.0 | 0.363 |
| 1038.0 | 0.353 |
| 1037.0 | 0.342 |
| 1036.0 | 0.33 |
| 1035.0 | 0.321 |
| 1034.0 | 0.315 |
| 1033.0 | 0.313 |
| 1032.0 | 0.314 |
| 1031.0 | 0.318 |
| 1030.0 | 0.322 |
| 1029.0 | 0.325 |
| 1028.0 | 0.327 |
| 1027.0 | 0.328 |
| 1026.0 | 0.329 |
| 1025.0 | 0.331 |
| 1024.0 | 0.333 |
| 1023.0 | 0.336 |
| 1022.0 | 0.338 |
| 1021.0 | 0.338 |
| 1020.0 | 0.337 |
| 1019.0 | 0.334 |
| 1018.0 | 0.33 |
| 1017.0 | 0.328 |
| 1016.0 | 0.329 |
| 1015.0 | 0.336 |
| 1014.0 | 0.349 |
| 1013.0 | 0.368 |
| 1012.0 | 0.387 |
| 1011.0 | 0.407 |
| 1010.0 | 0.422 |
| 1009.0 | 0.429 |
| 1008.0 | 0.427 |
| 1007.0 | 0.417 |
| 1006.0 | 0.399 |
| 1005.0 | 0.377 |
| 1004.0 | 0.356 |
| 1003.0 | 0.339 |
| 1002.0 | 0.33 |
| 1001.0 | 0.33 |
| 1000.0 | 0.336 |
| 999.0 | 0.343 |
| 998.0 | 0.347 |
| 997.0 | 0.345 |
| 996.0 | 0.335 |
| 995.0 | 0.319 |
| 994.0 | 0.3 |
| 993.0 | 0.281 |
| 992.0 | 0.266 |
| 991.0 | 0.258 |
| 990.0 | 0.255 |
| 989.0 | 0.254 |
| 988.0 | 0.254 |
| 987.0 | 0.251 |
| 986.0 | 0.247 |
| 985.0 | 0.243 |
| 984.0 | 0.241 |
| 983.0 | 0.245 |
| 982.0 | 0.255 |
| 981.0 | 0.271 |
| 980.0 | 0.289 |
| 979.0 | 0.306 |
| 978.0 | 0.32 |
| 977.0 | 0.328 |
| 976.0 | 0.333 |
| 975.0 | 0.334 |
| 974.0 | 0.335 |
| 973.0 | 0.339 |
| 972.0 | 0.345 |
| 971.0 | 0.352 |
| 970.0 | 0.359 |
| 969.0 | 0.362 |
| 968.0 | 0.36 |
| 967.0 | 0.354 |
| 966.0 | 0.347 |
| 965.0 | 0.344 |
| 964.0 | 0.349 |
| 963.0 | 0.366 |
| 962.0 | 0.393 |
| 961.0 | 0.423 |
| 960.0 | 0.451 |
| 959.0 | 0.465 |
| 958.0 | 0.462 |
| 957.0 | 0.441 |
| 956.0 | 0.407 |
| 955.0 | 0.368 |
| 954.0 | 0.335 |
| 953.0 | 0.32 |
| 952.0 | 0.325 |
| 951.0 | 0.345 |
| 950.0 | 0.374 |
| 949.0 | 0.397 |
| 948.0 | 0.405 |
| 947.0 | 0.39 |
| 946.0 | 0.356 |
| 945.0 | 0.309 |
| 944.0 | 0.262 |
| 943.0 | 0.229 |
| 942.0 | 0.213 |
| 941.0 | 0.216 |
| 940.0 | 0.228 |
| 939.0 | 0.242 |
| 938.0 | 0.247 |
| 937.0 | 0.238 |
| 936.0 | 0.218 |
| 935.0 | 0.192 |
| 934.0 | 0.17 |
| 933.0 | 0.157 |
| 932.0 | 0.155 |
| 931.0 | 0.162 |
| 930.0 | 0.173 |
| 929.0 | 0.179 |
| 928.0 | 0.178 |
| 927.0 | 0.17 |
| 926.0 | 0.159 |
| 925.0 | 0.154 |
| 924.0 | 0.158 |
| 923.0 | 0.173 |
| 922.0 | 0.193 |
| 921.0 | 0.213 |
| 920.0 | 0.227 |
| 919.0 | 0.232 |
| 918.0 | 0.227 |
| 917.0 | 0.219 |
| 916.0 | 0.214 |
| 915.0 | 0.214 |
| 914.0 | 0.219 |
| 913.0 | 0.226 |
| 912.0 | 0.23 |
| 911.0 | 0.227 |
| 910.0 | 0.215 |
| 909.0 | 0.197 |
| 908.0 | 0.176 |
| 907.0 | 0.158 |
| 906.0 | 0.145 |
| 905.0 | 0.136 |
| 904.0 | 0.129 |
| 903.0 | 0.122 |
| 902.0 | 0.115 |
| 901.0 | 0.108 |
| 900.0 | 0.103 |
| 899.0 | 0.101 |
| 898.0 | 0.102 |
| 897.0 | 0.104 |
| 896.0 | 0.106 |
| 895.0 | 0.107 |
| 894.0 | 0.107 |
| 893.0 | 0.108 |
| 892.0 | 0.113 |
| 891.0 | 0.123 |
| 890.0 | 0.138 |
| 889.0 | 0.155 |
| 888.0 | 0.17 |
| 887.0 | 0.179 |
| 886.0 | 0.183 |
| 885.0 | 0.183 |
| 884.0 | 0.184 |
| 883.0 | 0.189 |
| 882.0 | 0.2 |
| 881.0 | 0.215 |
| 880.0 | 0.231 |
| 879.0 | 0.241 |
| 878.0 | 0.243 |
| 877.0 | 0.237 |
| 876.0 | 0.226 |
| 875.0 | 0.214 |
| 874.0 | 0.205 |
| 873.0 | 0.2 |
| 872.0 | 0.196 |
| 871.0 | 0.19 |
| 870.0 | 0.18 |
| 869.0 | 0.166 |
| 868.0 | 0.15 |
| 867.0 | 0.134 |
| 866.0 | 0.119 |
| 865.0 | 0.107 |
| 864.0 | 0.098 |
| 863.0 | 0.091 |
| 862.0 | 0.085 |
| 861.0 | 0.08 |
| 860.0 | 0.072 |
| 859.0 | 0.057 |
| 858.0 | 0.045 |
| 857.0 | 0.048 |
| 856.0 | 0.063 |
| 855.0 | 0.081 |
| 854.0 | 0.094 |
| 853.0 | 0.101 |
| 852.0 | 0.109 |
| 851.0 | 0.126 |
| 850.0 | 0.157 |
| 849.0 | 0.199 |
| 848.0 | 0.246 |
| 847.0 | 0.289 |
| 846.0 | 0.32 |
| 845.0 | 0.338 |
| 844.0 | 0.347 |
| 843.0 | 0.351 |
| 842.0 | 0.353 |
| 841.0 | 0.355 |
| 840.0 | 0.358 |
| 839.0 | 0.362 |
| 838.0 | 0.367 |
| 837.0 | 0.373 |
| 836.0 | 0.379 |
| 835.0 | 0.385 |
| 834.0 | 0.388 |
| 833.0 | 0.385 |
| 832.0 | 0.377 |
| 831.0 | 0.365 |
| 830.0 | 0.355 |
| 829.0 | 0.348 |
| 828.0 | 0.347 |
| 827.0 | 0.349 |
| 826.0 | 0.348 |
| 825.0 | 0.339 |
| 824.0 | 0.319 |
| 823.0 | 0.293 |
| 822.0 | 0.265 |
| 821.0 | 0.242 |
| 820.0 | 0.226 |
| 819.0 | 0.216 |
| 818.0 | 0.206 |
| 817.0 | 0.19 |
| 816.0 | 0.164 |
| 815.0 | 0.131 |
| 814.0 | 0.097 |
| 813.0 | 0.068 |
| 812.0 | 0.05 |
| 811.0 | 0.042 |
| 810.0 | 0.041 |
| 809.0 | 0.042 |
| 808.0 | 0.041 |
| 807.0 | 0.037 |
| 806.0 | 0.031 |
| 805.0 | 0.024 |
| 804.0 | 0.018 |
| 803.0 | 0.013 |
| 802.0 | 0.009 |
| 801.0 | 0.006 |
| 800.0 | 0.004 |
| 799.0 | 0.003 |
| 798.0 | 0.003 |
| 797.0 | 0.003 |
| 796.0 | 0.004 |
| 795.0 | 0.004 |
| 794.0 | 0.004 |
| 793.0 | 0.005 |
| 792.0 | 0.005 |
| 791.0 | 0.005 |
| 790.0 | 0.004 |
| 789.0 | 0.004 |
| 788.0 | 0.004 |
| 787.0 | 0.005 |
| 786.0 | 0.006 |
| 785.0 | 0.007 |
| 784.0 | 0.007 |
| 783.0 | 0.007 |
| 782.0 | 0.006 |
| 781.0 | 0.005 |
| 780.0 | 0.004 |
| 779.0 | 0.004 |
| 778.0 | 0.005 |
| 777.0 | 0.006 |
| 776.0 | 0.006 |
| 775.0 | 0.006 |
| 774.0 | 0.005 |
| 773.0 | 0.004 |
| 772.0 | 0.004 |
| 771.0 | 0.004 |
| 770.0 | 0.004 |
| 769.0 | 0.005 |
| 768.0 | 0.005 |
| 767.0 | 0.004 |
| 766.0 | 0.004 |
| 765.0 | 0.003 |
| 764.0 | 0.004 |
| 763.0 | 0.005 |
| 762.0 | 0.006 |
| 761.0 | 0.008 |
| 760.0 | 0.009 |
| 759.0 | 0.008 |
| 758.0 | 0.006 |
| 757.0 | 0.005 |
| 756.0 | 0.004 |
| 755.0 | 0.005 |
| 754.0 | 0.007 |
| 753.0 | 0.007 |
| 752.0 | 0.006 |
| 751.0 | 0.005 |
| 750.0 | 0.004 |
| 749.0 | 0.003 |
| 748.0 | 0.004 |
| 747.0 | 0.005 |
| 746.0 | 0.006 |
| 745.0 | 0.006 |
| 744.0 | 0.005 |
| 743.0 | 0.004 |
| 742.0 | 0.003 |
| 741.0 | 0.003 |
| 740.0 | 0.005 |
| 739.0 | 0.007 |
| 738.0 | 0.008 |
| 737.0 | 0.008 |
| 736.0 | 0.007 |
| 735.0 | 0.004 |
| 734.0 | 0.003 |
| 733.0 | 0.003 |
| 732.0 | 0.003 |
| 731.0 | 0.003 |
| 730.0 | 0.004 |
| 729.0 | 0.004 |
| 728.0 | 0.005 |
| 727.0 | 0.006 |
| 726.0 | 0.005 |
| 725.0 | 0.004 |
| 724.0 | 0.003 |
| 723.0 | 0.003 |
| 722.0 | 0.004 |
| 721.0 | 0.004 |
| 720.0 | 0.003 |
| 719.0 | 0.003 |
| 718.0 | 0.003 |
| 717.0 | 0.004 |
| 716.0 | 0.005 |
| 715.0 | 0.004 |
| 714.0 | 0.003 |
| 713.0 | 0.003 |
| 712.0 | 0.004 |
| 711.0 | 0.004 |
| 710.0 | 0.004 |
| 709.0 | 0.003 |
| 708.0 | 0.003 |
| 707.0 | 0.004 |
| 706.0 | 0.004 |
| 705.0 | 0.004 |
| 704.0 | 0.002 |
| 703.0 | 0.003 |
| 702.0 | 0.004 |
| 701.0 | 0.004 |
| 700.0 | 0.004 |
| 699.0 | 0.003 |
| 698.0 | 0.002 |
| 697.0 | 0.003 |
| 696.0 | 0.003 |
| 695.0 | 0.003 |
| 694.0 | 0.003 |
| 693.0 | 0.003 |
| 692.0 | 0.003 |
| 691.0 | 0.004 |
| 690.0 | 0.003 |
| 689.0 | 0.003 |
| 688.0 | 0.004 |
| 687.0 | 0.004 |
| 686.0 | 0.004 |
| 685.0 | 0.003 |
| 684.0 | 0.004 |
| 683.0 | 0.005 |
| 682.0 | 0.005 |
| 681.0 | 0.004 |
| 680.0 | 0.003 |
| 679.0 | 0.004 |
| 678.0 | 0.004 |
| 677.0 | 0.004 |
| 676.0 | 0.003 |
| 675.0 | 0.003 |
| 674.0 | 0.004 |
| 673.0 | 0.004 |
| 672.0 | 0.003 |
| 671.0 | 0.004 |
| 670.0 | 0.006 |
| 669.0 | 0.006 |
| 668.0 | 0.005 |
| 667.0 | 0.004 |
| 666.0 | 0.004 |
| 665.0 | 0.005 |
| 664.0 | 0.005 |
| 663.0 | 0.004 |
| 662.0 | 0.004 |
| 661.0 | 0.005 |
| 660.0 | 0.005 |
| 659.0 | 0.004 |
| 658.0 | 0.004 |
| 657.0 | 0.005 |
| 656.0 | 0.005 |
| 655.0 | 0.005 |
| 654.0 | 0.004 |
| 653.0 | 0.004 |
| 652.0 | 0.005 |
| 651.0 | 0.004 |
| 650.0 | 0.009 |
| 649.0 | 0.007 |
| 648.0 | 0.007 |
| 647.0 | 0.008 |
| 646.0 | 0.008 |
| 645.0 | 0.01 |
| 644.0 | 0.003 |
| 643.0 | 0.006 |
| 642.0 | 0.007 |
| 641.0 | 0.005 |
| 640.0 | 0.01 |
| 639.0 | 0.007 |
| 638.0 | 0.007 |
| 637.0 | 0.01 |
| 636.0 | 0.006 |
| 635.0 | 0.005 |
| 634.0 | 0.012 |
| 633.0 | 0.01 |
| 632.0 | 0.007 |
| 631.0 | 0.009 |
| 630.0 | 0.009 |
| 629.0 | 0.008 |
| 628.0 | 0.006 |
| 627.0 | 0.004 |
| 626.0 | 0.006 |
| 625.0 | 0.006 |
| 624.0 | 0.005 |
| 623.0 | 0.008 |
| 622.0 | 0.007 |
| 621.0 | 0.005 |
| 620.0 | 0.006 |
| 619.0 | 0.008 |
| 618.0 | 0.01 |
| 617.0 | 0.006 |
| 616.0 | 0.009 |
| 615.0 | 0.013 |
| 614.0 | 0.01 |
| 613.0 | 0.004 |
| 612.0 | 0.006 |
| 611.0 | 0.007 |
| 610.0 | 0.007 |
| 609.0 | 0.007 |
| 608.0 | 0.007 |
| 607.0 | 0.008 |
| 606.0 | 0.005 |
| 605.0 | 0.007 |
| 604.0 | 0.012 |
| 603.0 | 0.005 |
| 602.0 | 0.006 |
| 601.0 | 0.008 |
| 600.0 | 0.006 |
| 599.0 | 0.005 |
| 598.0 | 0.01 |
| 597.0 | 0.009 |
| 596.0 | 0.006 |
| 595.0 | 0.006 |
| 594.0 | 0.007 |
| 593.0 | 0.007 |
| 592.0 | 0.004 |
| 591.0 | 0.009 |
| 590.0 | 0.009 |
| 589.0 | 0.005 |
| 588.0 | 0.009 |
| 587.0 | 0.009 |
| 586.0 | 0.004 |
| 585.0 | 0.009 |
| 584.0 | 0.009 |
| 583.0 | 0.006 |
| 582.0 | 0.006 |
| 581.0 | 0.008 |
| 580.0 | 0.007 |
| 579.0 | 0.004 |
| 578.0 | 0.006 |
| 577.0 | 0.004 |
| 576.0 | 0.003 |
| 575.0 | 0.008 |
| 574.0 | 0.007 |
| 573.0 | 0.006 |
| 572.0 | 0.008 |
| 571.0 | 0.008 |
| 570.0 | 0.006 |
| 569.0 | 0.008 |
| 568.0 | 0.007 |
| 567.0 | 0.007 |
| 566.0 | 0.008 |
| 565.0 | 0.005 |
| 564.0 | 0.006 |
| 563.0 | 0.011 |
| 562.0 | 0.007 |
| 561.0 | 0.005 |
| 560.0 | 0.008 |
| 559.0 | 0.007 |
| 558.0 | 0.008 |
| 557.0 | 0.013 |
| 556.0 | 0.008 |
| 555.0 | 0.006 |
| 554.0 | 0.009 |
| 553.0 | 0.007 |
| 552.0 | 0.008 |
| 551.0 | 0.01 |
| 550.0 | 0.005 |
| 549.0 | 0.01 |
| 548.0 | 0.009 |
| 547.0 | 0.008 |
| 546.0 | 0.014 |
| 545.0 | 0.011 |
| 544.0 | 0.009 |
| 543.0 | 0.014 |
| 542.0 | 0.009 |
| 541.0 | 0.011 |
| 540.0 | 0.014 |
| 539.0 | 0.009 |
| 538.0 | 0.013 |
| 537.0 | 0.011 |
| 536.0 | 0.01 |
| 535.0 | 0.016 |
| 534.0 | 0.01 |
| 533.0 | 0.013 |
| 532.0 | 0.018 |
| 531.0 | 0.011 |
| 530.0 | 0.016 |
| 529.0 | 0.013 |
| 528.0 | 0.014 |
| 527.0 | 0.016 |
| 526.0 | 0.013 |
| 525.0 | 0.021 |
| 524.0 | 0.017 |
| 523.0 | 0.021 |
| 522.0 | 0.021 |
| 521.0 | 0.017 |
| 520.0 | 0.025 |
| 519.0 | 0.02 |
| 518.0 | 0.023 |
| 517.0 | 0.021 |
| 516.0 | 0.02 |
| 515.0 | 0.025 |
| 514.0 | 0.018 |
| 513.0 | 0.026 |
| 512.0 | 0.022 |
| 511.0 | 0.024 |
| 510.0 | 0.024 |
| 509.0 | 0.013 |
| 508.0 | 0.014 |
| 507.0 | 0.014 |
| 506.0 | 0.017 |
| 505.0 | 0.017 |
| 504.0 | 0.019 |
| 503.0 | 0.016 |
| 502.0 | 0.021 |
| 501.0 | 0.023 |
| 500.0 | 0.034 |
| 499.0 | 0.046 |
| 498.0 | 0.077 |
| 497.0 | 0.813 |
| 496.0 | 1.01 |
| 495.0 | 1.538 |
| 494.0 | 3.206 |
| 493.0 | 4.19 |
| 492.0 | 4.864 |
| 491.0 | 5.735 |
| 490.0 | 6.091 |
| 489.0 | 6.064 |
| 488.0 | 6.06 |
| 487.0 | 5.231 |
| 486.0 | 4.354 |
| 485.0 | 3.51 |
| 484.0 | 1.88 |
| 483.0 | 1.066 |
| 482.0 | 0.088 |
| 481.0 | 0.02 |
| 480.0 | 0.018 |
| 479.0 | 0.016 |
| 478.0 | 0.015 |
| 477.0 | 0.013 |
| 476.0 | 0.01 |
| 475.0 | 0.011 |
| 474.0 | 0.01 |
| 473.0 | 0.011 |
| 472.0 | 0.01 |
| 471.0 | 0.011 |
| 470.0 | 0.013 |
| 469.0 | 0.012 |
| 468.0 | 0.016 |
| 467.0 | 0.02 |
| 466.0 | 0.02 |
| 465.0 | 0.018 |
| 464.0 | 0.017 |
| 463.0 | 0.016 |
| 462.0 | 0.016 |
| 461.0 | 0.018 |
| 460.0 | 0.017 |
| 459.0 | 0.017 |
| 458.0 | 0.016 |
| 457.0 | 0.017 |
| 456.0 | 0.017 |
| 455.0 | 0.017 |
| 454.0 | 0.017 |
| 453.0 | 0.013 |
| 452.0 | 0.013 |
| 451.0 | 0.012 |
| 450.0 | 0.012 |
| 449.0 | 0.013 |
| 448.0 | 0.013 |
| 447.0 | 0.014 |
| 446.0 | 0.013 |
| 445.0 | 0.012 |
| 444.0 | 0.014 |
| 443.0 | 0.014 |
| 442.0 | 0.012 |
| 441.0 | 0.012 |
| 440.0 | 0.012 |
| 439.0 | 0.012 |
| 438.0 | 0.015 |
| 437.0 | 0.015 |
| 436.0 | 0.014 |
| 435.0 | 0.013 |
| 434.0 | 0.012 |
| 433.0 | 0.012 |
| 432.0 | 0.015 |
| 431.0 | 0.014 |
| 430.0 | 0.013 |
| 429.0 | 0.013 |
| 428.0 | 0.013 |
| 427.0 | 0.013 |
| 426.0 | 0.013 |
| 425.0 | 0.013 |
| 424.0 | 0.012 |
| 423.0 | 0.012 |
| 422.0 | 0.013 |
| 421.0 | 0.013 |
| 420.0 | 0.014 |
| 419.0 | 0.013 |
| 418.0 | 0.014 |
| 417.0 | 0.014 |
| 416.0 | 0.012 |
| 415.0 | 0.015 |
| 414.0 | 0.017 |
| 413.0 | 0.016 |
| 412.0 | 0.015 |
| 411.0 | 0.014 |
| 410.0 | 0.015 |
| 409.0 | 0.017 |
| 408.0 | 0.017 |
| 407.0 | 0.017 |
| 406.0 | 0.017 |
| 405.0 | 0.019 |
| 404.0 | 0.02 |
| 403.0 | 0.021 |
| 402.0 | 0.021 |
| 401.0 | 0.021 |
| 400.0 | 0.023 |
| 399.0 | 0.023 |
| 398.0 | 0.024 |
| 397.0 | 0.024 |
| 396.0 | 0.026 |
| 395.0 | 0.028 |
| 394.0 | 0.03 |
| 393.0 | 0.032 |
| 392.0 | 0.038 |
| 391.0 | 0.05 |
| 390.0 | 0.063 |
| 389.0 | 0.074 |
| 388.0 | 0.094 |
| 387.0 | 0.127 |
| 386.0 | 0.164 |
| 385.0 | 0.205 |
| 384.0 | 0.247 |
| 383.0 | 0.295 |
| 382.0 | 0.372 |
| 381.0 | 0.467 |
| 380.0 | 0.53 |
| 379.0 | 0.575 |
| 378.0 | 0.642 |
| 377.0 | 0.669 |
| 376.0 | 0.69 |
| 375.0 | 0.792 |
| 374.0 | 0.945 |
| 373.0 | 1.033 |
| 372.0 | 1.092 |
| 371.0 | 1.23 |
| 370.0 | 1.414 |
| 369.0 | 1.565 |
| 368.0 | 1.733 |
| 367.0 | 1.917 |
| 366.0 | 2.049 |
| 365.0 | 2.22 |
| 364.0 | 2.474 |
| 363.0 | 2.746 |
| 362.0 | 3.046 |
| 361.0 | 3.369 |
| 360.0 | 3.744 |
| 359.0 | 4.49 |
| 358.0 | 4.575 |
| 357.0 | 4.635 |
| 356.0 | 4.38 |
| 355.0 | 4.895 |
| 354.0 | 5.936 |
| 353.0 | 4.521 |
| 352.0 | 4.356 |
| 351.0 | 4.705 |
| 350.0 | 4.367 |
| 349.0 | 5.09 |
| 348.0 | 5.635 |
| 347.0 | 4.457 |
| 346.0 | 4.271 |
| 345.0 | 4.73 |
| 344.0 | 4.366 |
| 343.0 | 4.82 |
| 342.0 | 4.934 |
| 341.0 | 4.518 |
| 340.0 | 4.299 |
| 339.0 | 4.978 |
| 338.0 | 4.342 |
| 337.0 | 5.932 |
| 336.0 | 4.786 |
| 335.0 | 4.501 |
| 334.0 | 4.298 |
| 333.0 | 4.426 |
| 332.0 | 4.308 |
| 331.0 | 4.308 |
| 330.0 | 4.569 |
| 329.0 | 4.533 |
| 328.0 | 4.297 |
| 327.0 | 4.976 |
| 326.0 | 4.35 |
| 325.0 | 5.328 |
| 324.0 | 4.93 |
| 323.0 | 4.549 |
| 322.0 | 4.266 |
| 321.0 | 4.725 |
| 320.0 | 4.276 |
| 319.0 | 5.451 |
| 318.0 | 4.435 |
| 317.0 | 4.292 |
| 316.0 | 4.407 |
| 315.0 | 4.272 |
| 314.0 | 4.721 |
| 313.0 | 5.447 |
| 312.0 | 5.079 |
| 311.0 | 4.447 |
| 310.0 | 4.38 |
| 309.0 | 4.777 |
| 308.0 | 4.461 |
| 307.0 | 5.446 |
| 306.0 | 5.446 |
| 305.0 | 4.378 |
| 304.0 | 4.378 |
| 303.0 | 4.88 |
| 302.0 | 4.524 |
| 301.0 | 4.967 |
| 300.0 | 5.62 |
| 299.0 | 4.444 |
| 298.0 | 4.308 |
| 297.0 | 4.415 |
| 296.0 | 4.473 |
| 295.0 | 5.618 |
| 294.0 | 5.618 |
| 293.0 | 4.457 |
| 292.0 | 4.306 |
| 291.0 | 4.521 |
| 290.0 | 4.456 |
| 289.0 | 5.316 |
| 288.0 | 4.503 |
| 287.0 | 4.486 |
| 286.0 | 4.294 |
| 285.0 | 4.594 |
| 284.0 | 4.349 |
| 283.0 | 5.616 |
| 282.0 | 4.615 |
| 281.0 | 4.518 |
| 280.0 | 4.217 |
| 279.0 | 5.914 |
| 278.0 | 4.216 |
| 277.0 | 4.915 |
| 276.0 | 4.438 |
| 275.0 | 4.483 |
| 274.0 | 4.215 |
| 273.0 | 4.395 |
| 272.0 | 4.358 |
| 271.0 | 5.312 |
| 270.0 | 4.658 |
| 269.0 | 4.436 |
| 268.0 | 4.28 |
| 267.0 | 5.311 |
| 266.0 | 4.959 |
| 265.0 | 4.959 |
| 264.0 | 5.068 |
| 263.0 | 4.333 |
| 262.0 | 4.222 |
| 261.0 | 5.009 |
| 260.0 | 4.299 |
| 259.0 | 5.434 |
| 258.0 | 4.912 |
| 257.0 | 4.32 |
| 256.0 | 4.309 |
| 255.0 | 5.132 |
| 254.0 | 4.342 |
| 253.0 | 5.064 |
| 252.0 | 4.909 |
| 251.0 | 4.219 |
| 250.0 | 4.218 |
| 249.0 | 4.376 |
| 248.0 | 4.364 |
| 247.0 | 5.129 |
| 246.0 | 5.907 |
| 245.0 | 4.316 |
| 244.0 | 4.415 |
| 243.0 | 4.244 |
| 242.0 | 4.35 |
| 241.0 | 5.003 |
| 240.0 | 5.429 |
| 239.0 | 4.191 |
| 238.0 | 4.388 |
| 237.0 | 4.628 |
| 236.0 | 4.305 |
| 235.0 | 4.828 |
| 234.0 | 5.129 |
| 233.0 | 4.217 |
| 232.0 | 4.362 |
| 231.0 | 4.315 |
| 230.0 | 4.429 |
| 229.0 | 4.864 |
| 228.0 | 5.059 |
| 227.0 | 4.172 |
| 226.0 | 4.412 |
| 225.0 | 4.672 |
| 224.0 | 4.47 |
| 223.0 | 4.901 |
| 222.0 | 4.997 |
| 221.0 | 4.218 |
| 220.0 | 4.296 |
| 219.0 | 4.295 |
| 218.0 | 4.482 |
| 217.0 | 4.482 |
| 216.0 | 4.94 |
| 215.0 | 4.314 |
| 214.0 | 4.375 |
| 213.0 | 4.29 |
| 212.0 | 4.335 |
| 211.0 | 4.812 |
| 210.0 | 4.528 |
| 209.0 | 4.276 |
| 208.0 | 4.265 |
| 207.0 | 4.44 |
| 206.0 | 4.215 |
| 205.0 | 4.631 |
| 204.0 | 4.47 |
| 203.0 | 4.092 |
| 202.0 | 4.051 |
| 201.0 | 4.044 |
| 200.0 | 4.043 |